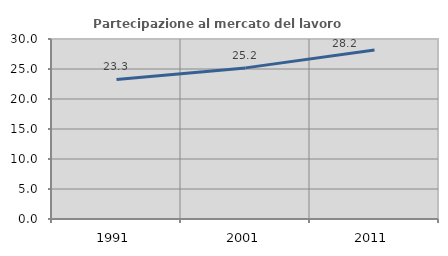
| Category | Partecipazione al mercato del lavoro  femminile |
|---|---|
| 1991.0 | 23.256 |
| 2001.0 | 25.185 |
| 2011.0 | 28.155 |